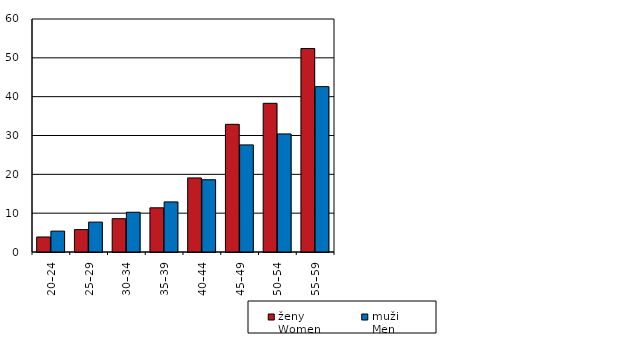
| Category | ženy  
Women | muži  
Men |
|---|---|---|
| 20–24 | 3869 | 5379 |
| 25–29 | 5766 | 7702 |
| 30–34 | 8575 | 10240 |
| 35–39 | 11382 | 12896 |
| 40–44 | 19076 | 18606 |
| 45–49 | 32879 | 27581 |
| 50–54 | 38290 | 30410 |
| 55–59 | 52400 | 42584 |